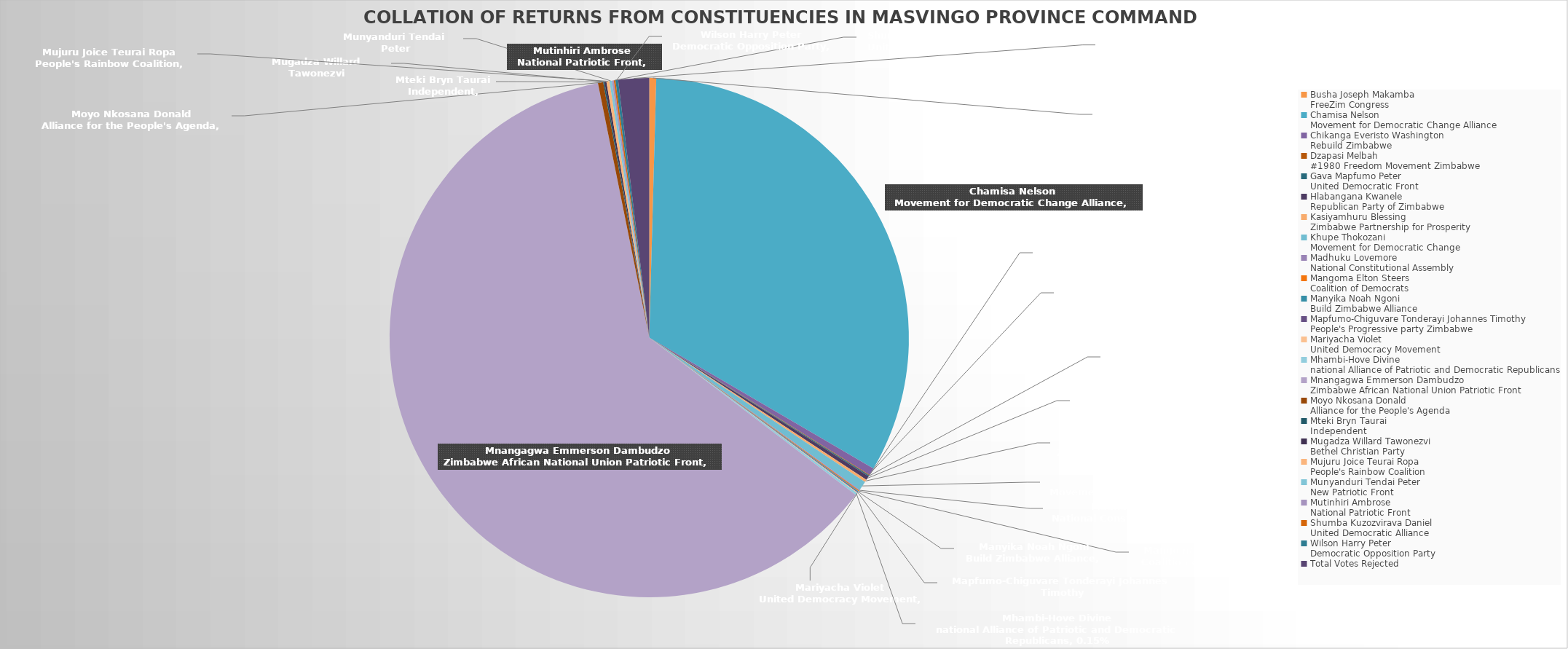
| Category | Series 0 |
|---|---|
| Busha Joseph Makamba
FreeZim Congress | 0.004 |
| Chamisa Nelson
Movement for Democratic Change Alliance | 0.33 |
| Chikanga Everisto Washington
Rebuild Zimbabwe | 0.005 |
| Dzapasi Melbah
#1980 Freedom Movement Zimbabwe | 0 |
| Gava Mapfumo Peter
United Democratic Front | 0.001 |
| Hlabangana Kwanele
Republican Party of Zimbabwe | 0.003 |
| Kasiyamhuru Blessing
Zimbabwe Partnership for Prosperity | 0.002 |
| Khupe Thokozani
Movement for Democratic Change | 0.006 |
| Madhuku Lovemore
National Constitutional Assembly | 0.001 |
| Mangoma Elton Steers
Coalition of Democrats | 0.001 |
| Manyika Noah Ngoni
Build Zimbabwe Alliance | 0.001 |
| Mapfumo-Chiguvare Tonderayi Johannes Timothy
People's Progressive party Zimbabwe | 0 |
| Mariyacha Violet
United Democracy Movement | 0 |
| Mhambi-Hove Divine
national Alliance of Patriotic and Democratic Republicans | 0.001 |
| Mnangagwa Emmerson Dambudzo
Zimbabwe African National Union Patriotic Front | 0.614 |
| Moyo Nkosana Donald
Alliance for the People's Agenda | 0.003 |
| Mteki Bryn Taurai
Independent | 0.001 |
| Mugadza Willard Tawonezvi
Bethel Christian Party | 0.001 |
| Mujuru Joice Teurai Ropa
People's Rainbow Coalition | 0.002 |
| Munyanduri Tendai Peter
New Patriotic Front | 0.002 |
| Mutinhiri Ambrose
National Patriotic Front | 0.001 |
| Shumba Kuzozvirava Daniel
United Democratic Alliance | 0.001 |
| Wilson Harry Peter
Democratic Opposition Party | 0.002 |
| Total Votes Rejected | 0.019 |